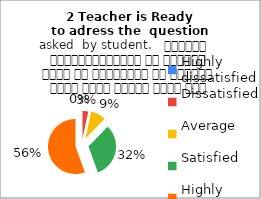
| Category | 2 Teacher is Ready
to adress the  question asked  by student.   शिक्षक विद्यार्थियों के द्वारा पूछे गए प्रश्नों का समाधान करने हेतु तत्पर रहते हैं |
|---|---|
| Highly dissatisfied | 0 |
| Dissatisfied | 3 |
| Average | 8 |
| Satisfied | 29 |
| Highly satisfied | 50 |